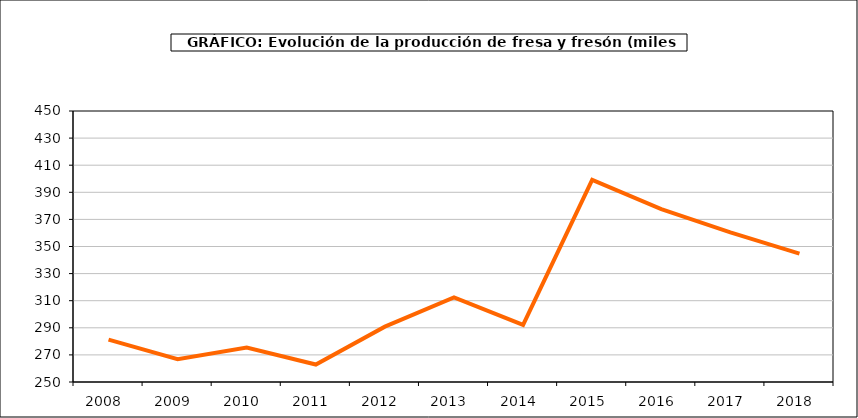
| Category | producción |
|---|---|
| 2008.0 | 281.24 |
| 2009.0 | 266.772 |
| 2010.0 | 275.355 |
| 2011.0 | 262.896 |
| 2012.0 | 290.843 |
| 2013.0 | 312.466 |
| 2014.0 | 292.101 |
| 2015.0 | 399.217 |
| 2016.0 | 377.596 |
| 2017.0 | 360.416 |
| 2018.0 | 344.679 |